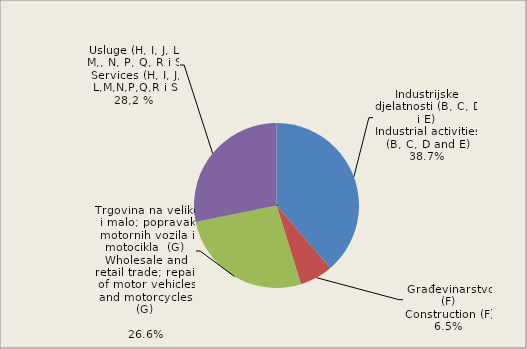
| Category | Broj zaposlenih osoba
Number of persons employed
  |
|---|---|
| Industrijske djelatnosti (B, C, D i E)
Industrial activities (B, C, D and E) | 38.7 |
| Građevinarstvo (F)
Construction (F) | 6.5 |
| Trgovina na veliko i malo; popravak motornih vozila i motocikla  (G) 
Wholesale and retail trade; repair of motor vehicles and motorcycles  (G)
 | 26.6 |
| Usluge (H, I i L)
Services (H, I and L) | 28.2 |